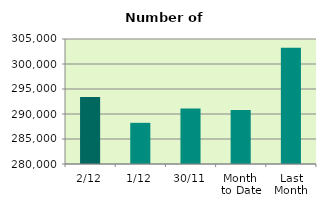
| Category | Series 0 |
|---|---|
| 2/12 | 293406 |
| 1/12 | 288234 |
| 30/11 | 291108 |
| Month 
to Date | 290820 |
| Last
Month | 303258.727 |